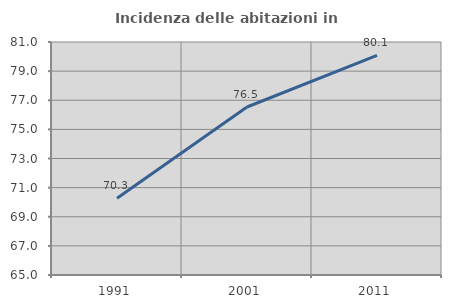
| Category | Incidenza delle abitazioni in proprietà  |
|---|---|
| 1991.0 | 70.263 |
| 2001.0 | 76.536 |
| 2011.0 | 80.078 |